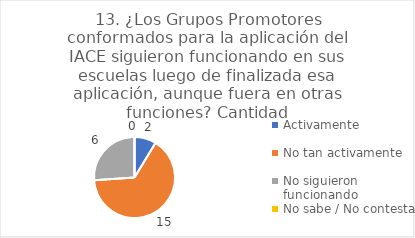
| Category | 13. ¿Los Grupos Promotores conformados para la aplicación del IACE siguieron funcionando en sus escuelas luego de finalizada esa aplicación, aunque fuera en otras funciones? |
|---|---|
| Activamente  | 0.087 |
| No tan activamente  | 0.652 |
| No siguieron funcionando  | 0.261 |
| No sabe / No contesta | 0 |